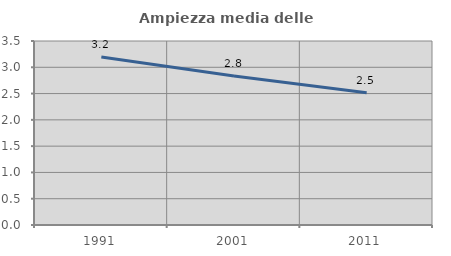
| Category | Ampiezza media delle famiglie |
|---|---|
| 1991.0 | 3.197 |
| 2001.0 | 2.835 |
| 2011.0 | 2.517 |